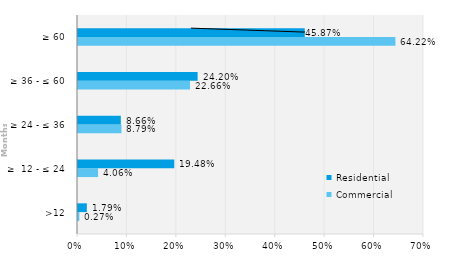
| Category | Commercial | Residential |
|---|---|---|
| >12 | 0.003 | 0.018 |
| ≥  12 - ≤ 24 | 0.041 | 0.195 |
| ≥ 24 - ≤ 36 | 0.088 | 0.087 |
| ≥ 36 - ≤ 60 | 0.227 | 0.242 |
| ≥ 60 | 0.642 | 0.459 |